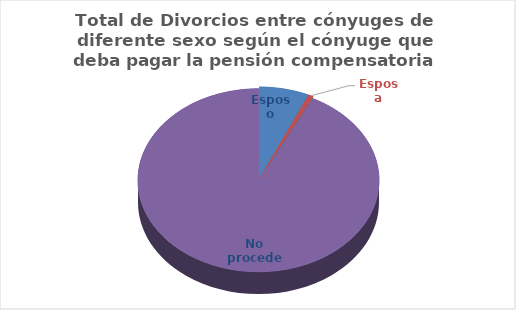
| Category | Series 0 |
|---|---|
| Esposo | 5318 |
| Esposa | 534 |
| No procede | 73701 |